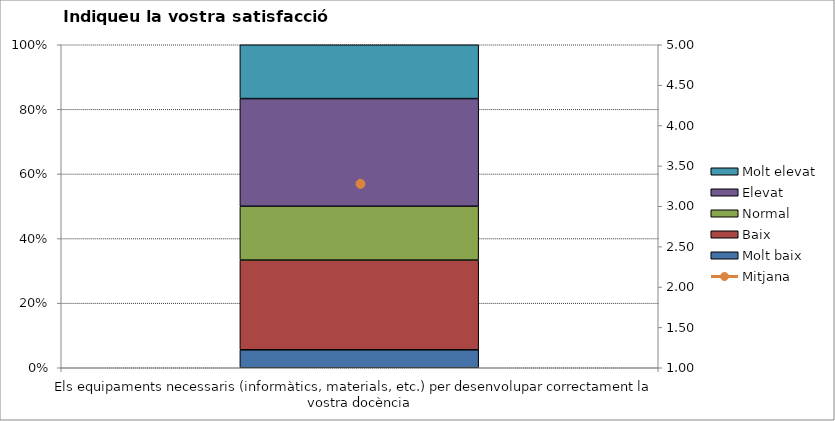
| Category | Molt baix | Baix | Normal  | Elevat | Molt elevat |
|---|---|---|---|---|---|
| Els equipaments necessaris (informàtics, materials, etc.) per desenvolupar correctament la vostra docència | 1 | 5 | 3 | 6 | 3 |